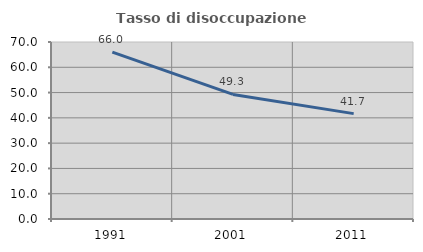
| Category | Tasso di disoccupazione giovanile  |
|---|---|
| 1991.0 | 65.972 |
| 2001.0 | 49.275 |
| 2011.0 | 41.667 |